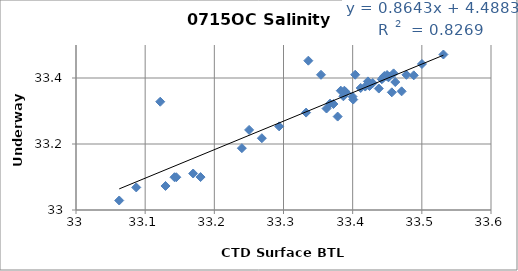
| Category | Series 0 |
|---|---|
| 33.4442 | 33.401 |
| 33.422 | 33.39 |
| 33.429 | 33.385 |
| 33.4517 | 33.402 |
| 33.4592 | 33.414 |
| 33.4421 | 33.396 |
| 33.5002 | 33.442 |
| 33.4243 | 33.376 |
| 33.4497 | 33.409 |
| 33.4498 | 33.406 |
| 33.2398 | 33.187 |
| 33.4616 | 33.388 |
| 33.4037 | 33.41 |
| 33.3542 | 33.41 |
| 33.4777 | 33.41 |
| 33.1424 | 33.099 |
| 33.2503 | 33.243 |
| 33.0625 | 33.029 |
| 33.5312 | 33.471 |
| 33.3866 | 33.345 |
| 33.2937 | 33.253 |
| 33.4458 | 33.406 |
| 33.4883 | 33.408 |
| 33.3359 | 33.452 |
| 33.4182 | 33.374 |
| 33.3828 | 33.362 |
| 33.388 | 33.362 |
| 33.4708 | 33.36 |
| 33.4566 | 33.357 |
| 33.4527 | 33.404 |
| 33.1801 | 33.1 |
| 33.3327 | 33.295 |
| 33.3673 | 33.322 |
| 33.4008 | 33.335 |
| 33.3783 | 33.283 |
| 33.4116 | 33.37 |
| 33.3903 | 33.357 |
| 33.3998 | 33.344 |
| 33.1218 | 33.328 |
| 33.0871 | 33.068 |
| 33.3722 | 33.321 |
| 33.4378 | 33.368 |
| 33.2687 | 33.218 |
| 33.1694 | 33.111 |
| 33.1294 | 33.073 |
| 33.3622 | 33.308 |
| 33.145 | 33.099 |